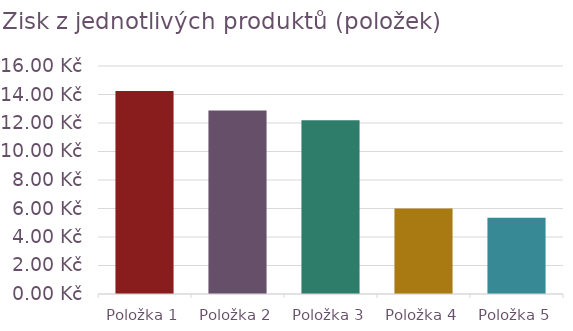
| Category | Zisk z položky 
(včetně dopravy) |
|---|---|
| Položka 1 | 14.25 |
| Položka 2 | 12.875 |
| Položka 3 | 12.2 |
| Položka 4 | 6 |
| Položka 5 | 5.35 |